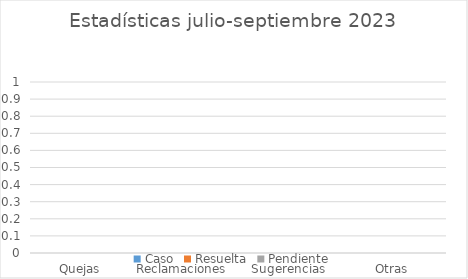
| Category | Caso | Resuelta | Pendiente |
|---|---|---|---|
| Quejas | 0 | 0 | 0 |
| Reclamaciones  | 0 | 0 | 0 |
| Sugerencias | 0 | 0 | 0 |
| Otras | 0 | 0 | 0 |